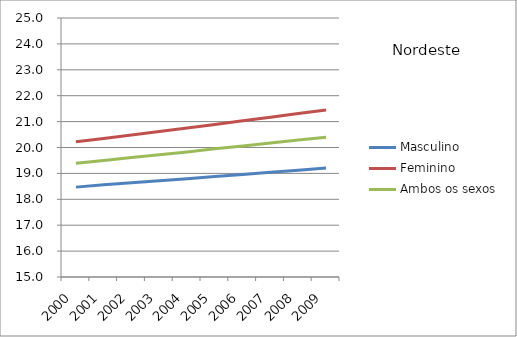
| Category | Masculino | Feminino | Ambos os sexos |
|---|---|---|---|
| 2000.0 | 18.47 | 20.22 | 19.39 |
| 2001.0 | 18.56 | 20.35 | 19.5 |
| 2002.0 | 18.64 | 20.48 | 19.61 |
| 2003.0 | 18.72 | 20.62 | 19.72 |
| 2004.0 | 18.79 | 20.75 | 19.83 |
| 2005.0 | 18.88 | 20.89 | 19.95 |
| 2006.0 | 18.96 | 21.03 | 20.06 |
| 2007.0 | 19.04 | 21.17 | 20.17 |
| 2008.0 | 19.12 | 21.31 | 20.29 |
| 2009.0 | 19.21 | 21.45 | 20.4 |